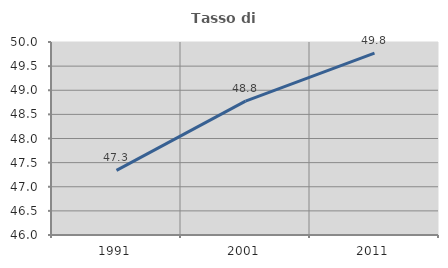
| Category | Tasso di occupazione   |
|---|---|
| 1991.0 | 47.338 |
| 2001.0 | 48.774 |
| 2011.0 | 49.768 |